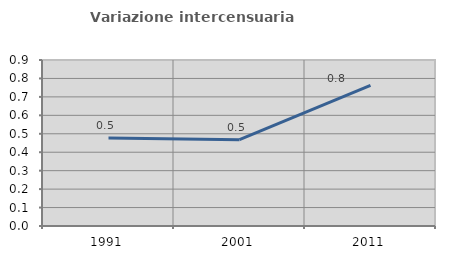
| Category | Variazione intercensuaria annua |
|---|---|
| 1991.0 | 0.477 |
| 2001.0 | 0.468 |
| 2011.0 | 0.762 |